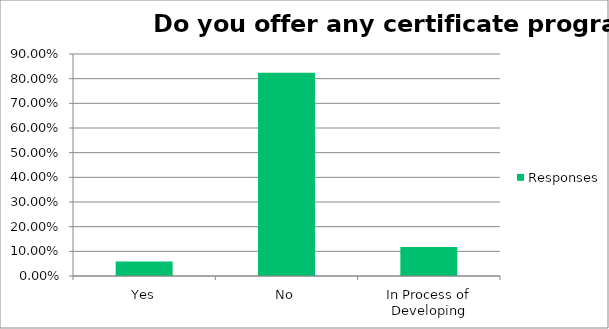
| Category | Responses |
|---|---|
| Yes | 0.059 |
| No | 0.823 |
| In Process of Developing | 0.118 |